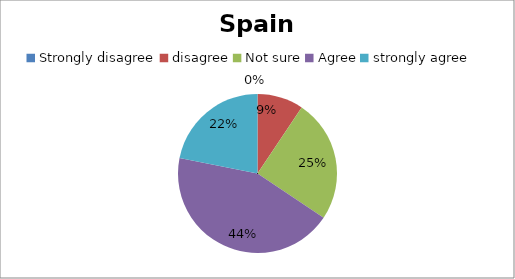
| Category | Series 0 |
|---|---|
| Strongly disagree | 0 |
| disagree | 3 |
| Not sure | 8 |
| Agree | 14 |
| strongly agree | 7 |